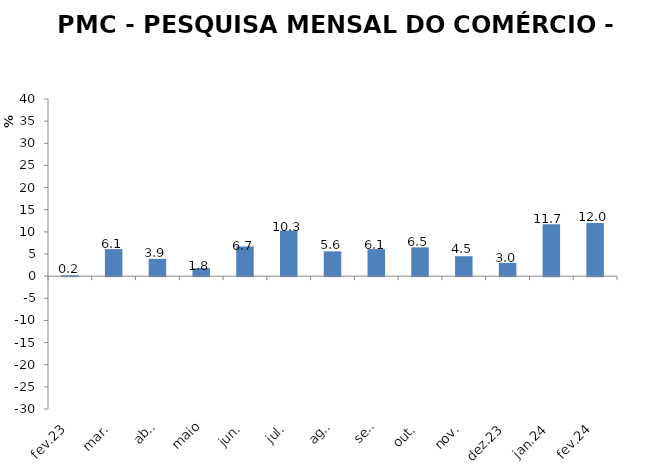
| Category | MENSAL |
|---|---|
| fev.23 | 0.2 |
| mar. | 6.1 |
| abr. | 3.9 |
| maio | 1.8 |
| jun. | 6.7 |
| jul. | 10.3 |
| ago. | 5.6 |
| set. | 6.1 |
| out. | 6.5 |
| nov. | 4.5 |
| dez.23 | 3 |
| jan.24 | 11.7 |
| fev.24 | 12 |